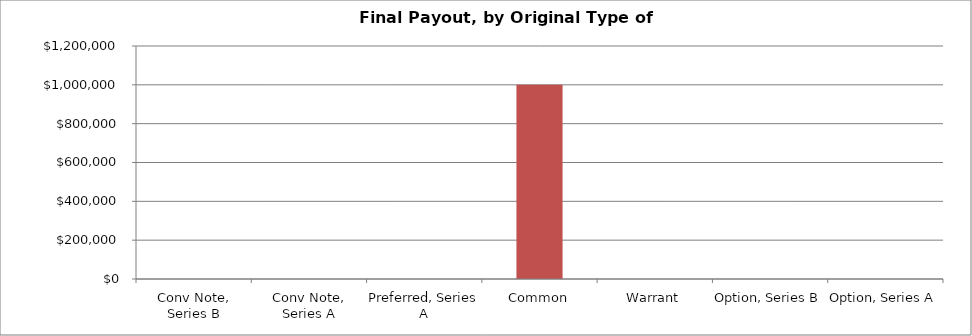
| Category | Payout |
|---|---|
| Conv Note, Series B | 0 |
| Conv Note, Series A | 0 |
| Preferred, Series A | 0 |
| Common | 1000000 |
| Warrant | 0 |
| Option, Series B | 0 |
| Option, Series A | 0 |